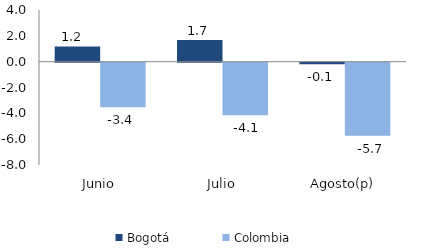
| Category | Bogotá | Colombia |
|---|---|---|
| Junio | 1.177 | -3.445 |
| Julio | 1.676 | -4.074 |
| Agosto(p) | -0.115 | -5.665 |